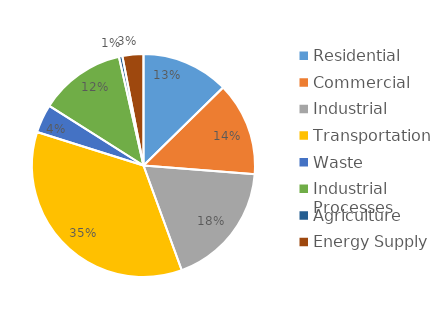
| Category | MTCO2e* |
|---|---|
| Residential | 666694 |
| Commercial | 716214 |
| Industrial | 957745 |
| Transportation | 1866061 |
| Waste | 217853 |
| Industrial Processes | 657315 |
| Agriculture | 26544 |
| Energy Supply | 160030 |